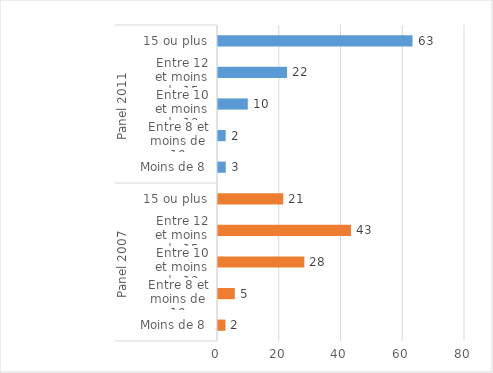
| Category | Series 0 |
|---|---|
| 0 | 2.42 |
| 1 | 5.44 |
| 2 | 27.97 |
| 3 | 43.06 |
| 4 | 21.12 |
| 5 | 2.51 |
| 6 | 2.48 |
| 7 | 9.65 |
| 8 | 22.36 |
| 9 | 63.01 |